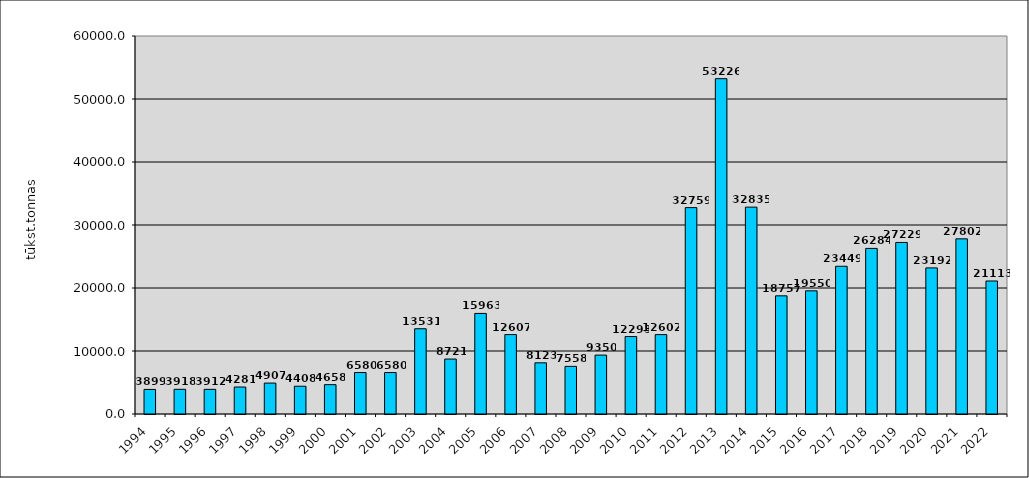
| Category | Series 0 |
|---|---|
| 1994.0 | 3899 |
| 1995.0 | 3918 |
| 1996.0 | 3912 |
| 1997.0 | 4281 |
| 1998.0 | 4907 |
| 1999.0 | 4408 |
| 2000.0 | 4658 |
| 2001.0 | 6580 |
| 2002.0 | 6580 |
| 2003.0 | 13531 |
| 2004.0 | 8721 |
| 2005.0 | 15963 |
| 2006.0 | 12607 |
| 2007.0 | 8123 |
| 2008.0 | 7558 |
| 2009.0 | 9350 |
| 2010.0 | 12293 |
| 2011.0 | 12602 |
| 2012.0 | 32759 |
| 2013.0 | 53226 |
| 2014.0 | 32835 |
| 2015.0 | 18757 |
| 2016.0 | 19550 |
| 2017.0 | 23449 |
| 2018.0 | 26284 |
| 2019.0 | 27229 |
| 2020.0 | 23192 |
| 2021.0 | 27802 |
| 2022.0 | 21113 |